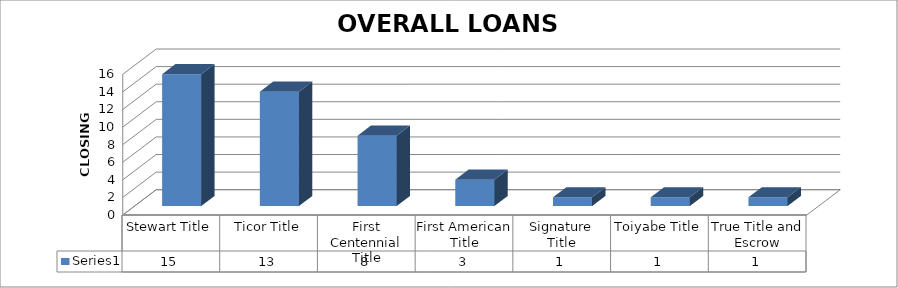
| Category | Series 0 |
|---|---|
| Stewart Title | 15 |
| Ticor Title | 13 |
| First Centennial Title | 8 |
| First American Title | 3 |
| Signature Title | 1 |
| Toiyabe Title | 1 |
| True Title and Escrow | 1 |